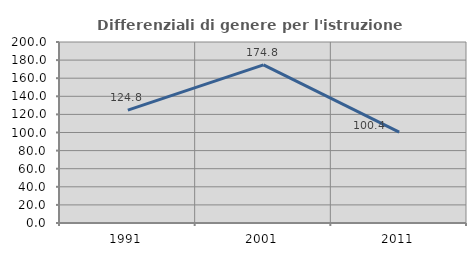
| Category | Differenziali di genere per l'istruzione superiore |
|---|---|
| 1991.0 | 124.752 |
| 2001.0 | 174.757 |
| 2011.0 | 100.427 |